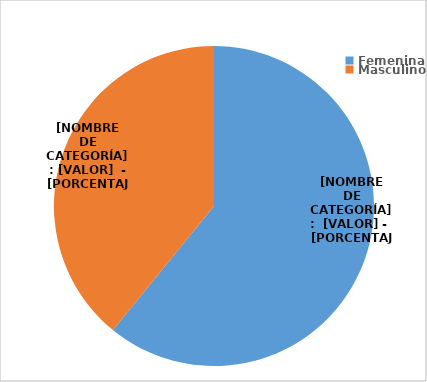
| Category | Series 0 |
|---|---|
| Femenina | 3371 |
| Masculino | 2166 |